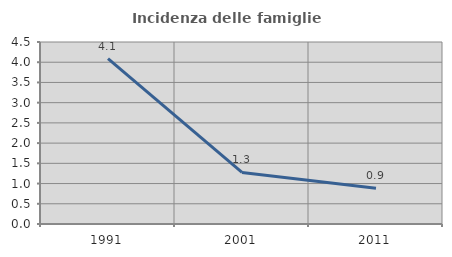
| Category | Incidenza delle famiglie numerose |
|---|---|
| 1991.0 | 4.088 |
| 2001.0 | 1.275 |
| 2011.0 | 0.882 |